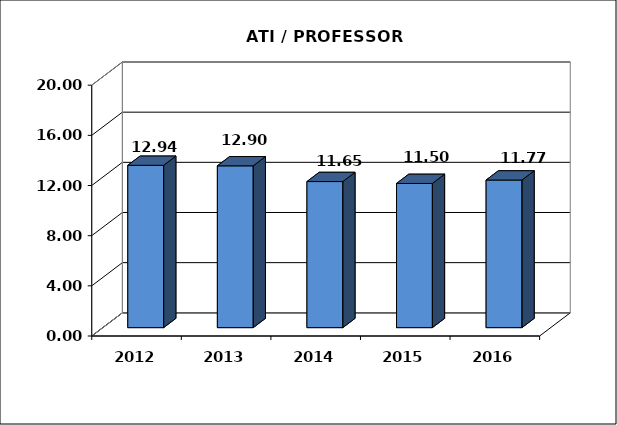
| Category | Series 0 |
|---|---|
| 2012.0 | 12.944 |
| 2013.0 | 12.904 |
| 2014.0 | 11.649 |
| 2015.0 | 11.498 |
| 2016.0 | 11.77 |